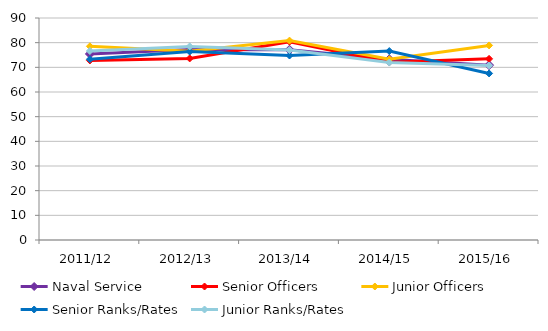
| Category | Naval Service | Senior Officers | Junior Officers | Senior Ranks/Rates | Junior Ranks/Rates |
|---|---|---|---|---|---|
| 2011/12 | 75.427 | 72.792 | 78.517 | 73.259 | 76.619 |
| 2012/13 | 77.196 | 73.608 | 76.567 | 76.407 | 78.469 |
| 2013/14 | 77.124 | 80.403 | 80.834 | 74.794 | 77.013 |
| 2014/15 | 73.289 | 72.036 | 73.283 | 76.6 | 71.928 |
| 2015/16 | 70.896 | 73.438 | 78.889 | 67.53 | 70.759 |